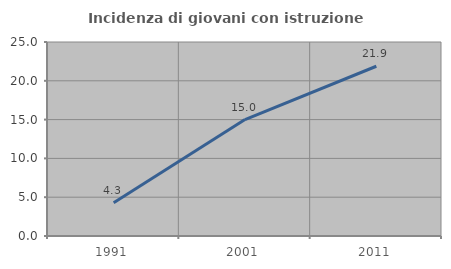
| Category | Incidenza di giovani con istruzione universitaria |
|---|---|
| 1991.0 | 4.286 |
| 2001.0 | 15 |
| 2011.0 | 21.875 |